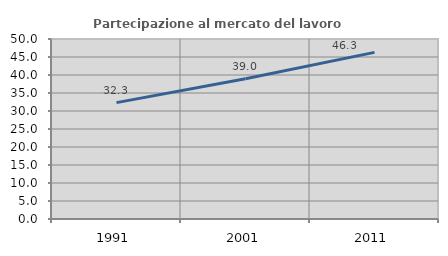
| Category | Partecipazione al mercato del lavoro  femminile |
|---|---|
| 1991.0 | 32.327 |
| 2001.0 | 38.953 |
| 2011.0 | 46.291 |